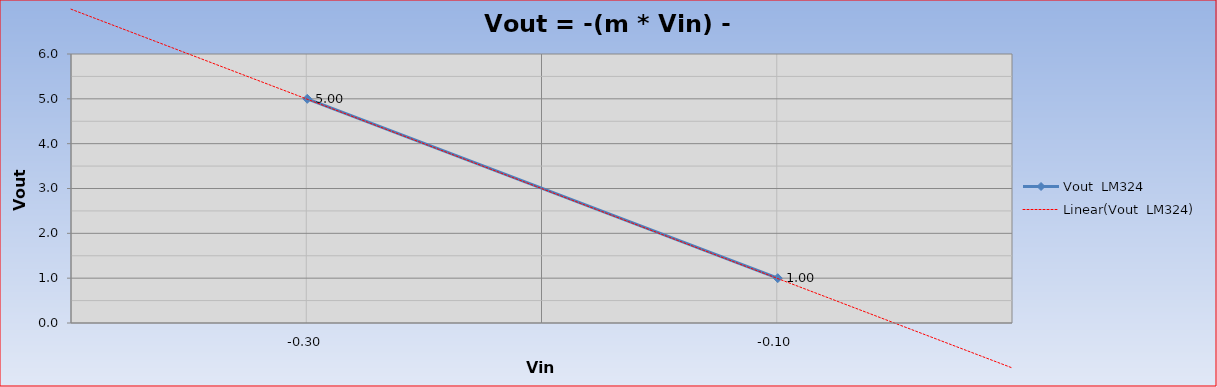
| Category | Vout  LM324 |
|---|---|
| -0.3 | 5 |
| -0.1 | 1 |